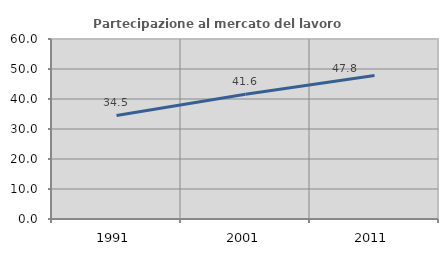
| Category | Partecipazione al mercato del lavoro  femminile |
|---|---|
| 1991.0 | 34.519 |
| 2001.0 | 41.571 |
| 2011.0 | 47.826 |